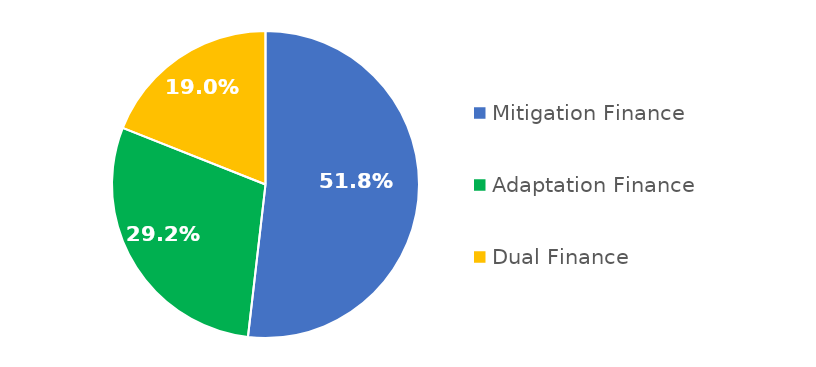
| Category | Series 0 |
|---|---|
| 0 | 2569163842.843 |
| 1 | 1446755532.169 |
| 2 | 941629182.061 |